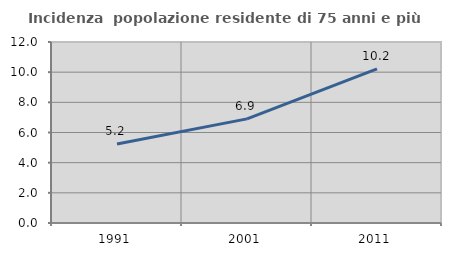
| Category | Incidenza  popolazione residente di 75 anni e più |
|---|---|
| 1991.0 | 5.235 |
| 2001.0 | 6.902 |
| 2011.0 | 10.224 |